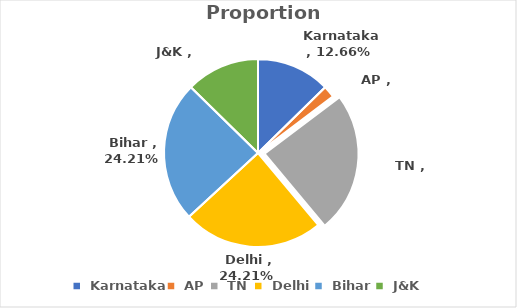
| Category |  Proportions  |
|---|---|
|  Karnataka  | 0.127 |
|  AP  | 0.02 |
|  TN  | 0.242 |
|  Delhi  | 0.242 |
|  Bihar  | 0.242 |
|  J&K  | 0.127 |